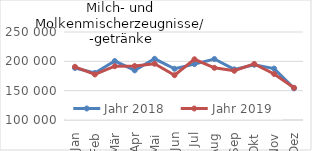
| Category | Jahr 2018 | Jahr 2019 |
|---|---|---|
| Jan | 188757.125 | 190663.015 |
| Feb | 180175.212 | 177650.346 |
| Mär | 200474.204 | 191645.709 |
| Apr | 184593.027 | 192052.138 |
| Mai | 204303.185 | 195909.956 |
| Jun | 187309.947 | 176392.45 |
| Jul | 195230.07 | 203511.147 |
| Aug | 203912.91 | 188981.529 |
| Sep | 186296.892 | 183886.212 |
| Okt | 194208.069 | 195564.581 |
| Nov | 187611.946 | 178405.14 |
| Dez | 153996.401 | 154822.392 |